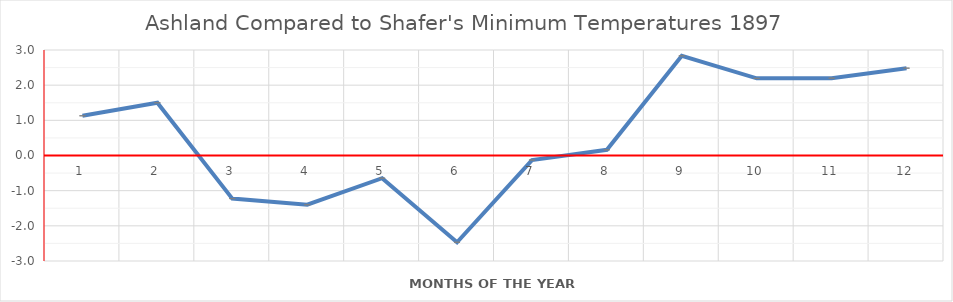
| Category | Series 0 |
|---|---|
| 0 | 1.129 |
| 1 | 1.5 |
| 2 | -1.226 |
| 3 | -1.4 |
| 4 | -0.645 |
| 5 | -2.467 |
| 6 | -0.129 |
| 7 | 0.161 |
| 8 | 2.833 |
| 9 | 2.194 |
| 10 | 2.2 |
| 11 | 2.484 |